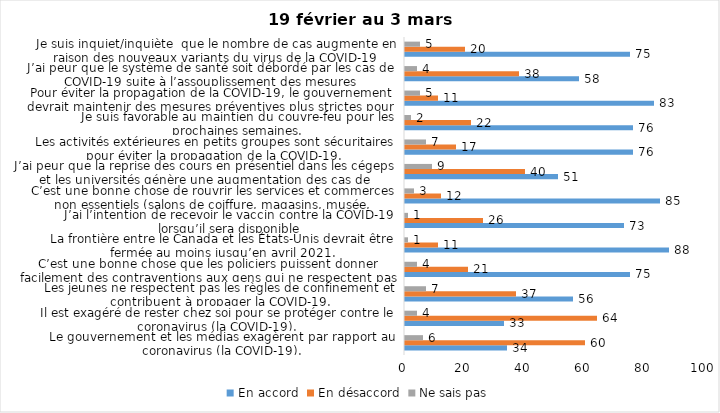
| Category | En accord | En désaccord | Ne sais pas |
|---|---|---|---|
| Le gouvernement et les médias exagèrent par rapport au coronavirus (la COVID-19). | 34 | 60 | 6 |
| Il est exagéré de rester chez soi pour se protéger contre le coronavirus (la COVID-19). | 33 | 64 | 4 |
| Les jeunes ne respectent pas les règles de confinement et contribuent à propager la COVID-19. | 56 | 37 | 7 |
| C’est une bonne chose que les policiers puissent donner facilement des contraventions aux gens qui ne respectent pas les mesures pour prévenir la COVID-19. | 75 | 21 | 4 |
| La frontière entre le Canada et les États-Unis devrait être fermée au moins jusqu’en avril 2021. | 88 | 11 | 1 |
| J’ai l’intention de recevoir le vaccin contre la COVID-19 lorsqu’il sera disponible | 73 | 26 | 1 |
| C’est une bonne chose de rouvrir les services et commerces non essentiels (salons de coiffure, magasins, musée, industries) à partir du 8 février 2021. | 85 | 12 | 3 |
| J’ai peur que la reprise des cours en présentiel dans les cégeps et les universités génère une augmentation des cas de COVID-19. | 51 | 40 | 9 |
| Les activités extérieures en petits groupes sont sécuritaires pour éviter la propagation de la COVID-19. | 76 | 17 | 7 |
| Je suis favorable au maintien du couvre-feu pour les prochaines semaines. | 76 | 22 | 2 |
| Pour éviter la propagation de la COVID-19, le gouvernement devrait maintenir des mesures préventives plus strictes pour la grande région de Montréal. | 83 | 11 | 5 |
| J’ai peur que le système de santé soit débordé par les cas de COVID-19 suite à l’assouplissement des mesures | 58 | 38 | 4 |
| Je suis inquiet/inquiète  que le nombre de cas augmente en raison des nouveaux variants du virus de la COVID-19 | 75 | 20 | 5 |